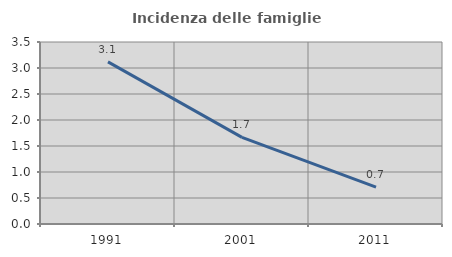
| Category | Incidenza delle famiglie numerose |
|---|---|
| 1991.0 | 3.119 |
| 2001.0 | 1.667 |
| 2011.0 | 0.708 |